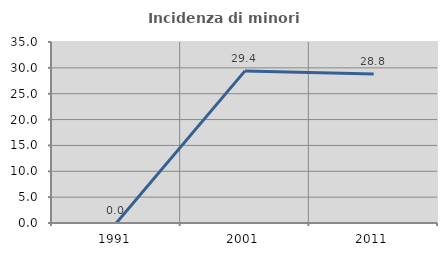
| Category | Incidenza di minori stranieri |
|---|---|
| 1991.0 | 0 |
| 2001.0 | 29.412 |
| 2011.0 | 28.8 |